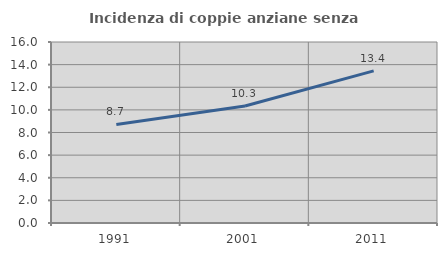
| Category | Incidenza di coppie anziane senza figli  |
|---|---|
| 1991.0 | 8.711 |
| 2001.0 | 10.345 |
| 2011.0 | 13.445 |